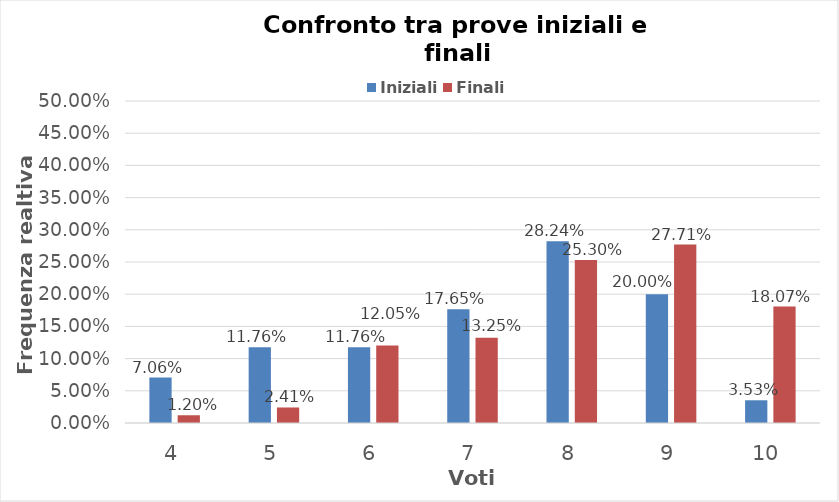
| Category | Iniziali | Finali |
|---|---|---|
| 4.0 | 0.071 | 0.012 |
| 5.0 | 0.118 | 0.024 |
| 6.0 | 0.118 | 0.12 |
| 7.0 | 0.176 | 0.133 |
| 8.0 | 0.282 | 0.253 |
| 9.0 | 0.2 | 0.277 |
| 10.0 | 0.035 | 0.181 |